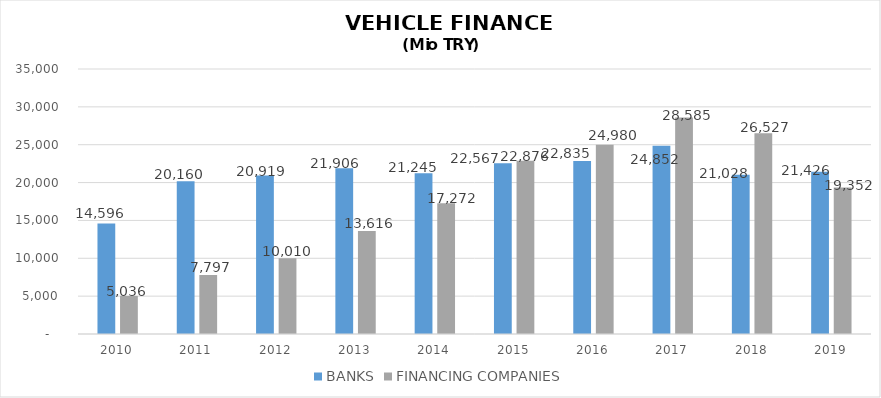
| Category | BANKS | FINANCING COMPANIES |
|---|---|---|
| 2010.0 | 14596 | 5035.89 |
| 2011.0 | 20160 | 7796.854 |
| 2012.0 | 20919 | 10009.755 |
| 2013.0 | 21906 | 13616.036 |
| 2014.0 | 21245 | 17271.844 |
| 2015.0 | 22567 | 22875.563 |
| 2016.0 | 22835 | 24980.231 |
| 2017.0 | 24852 | 28584.938 |
| 2018.0 | 21028 | 26527.133 |
| 2019.0 | 21426.2 | 19352.327 |